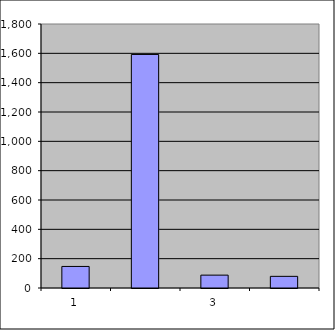
| Category | Series 0 |
|---|---|
| 0 | 147 |
| 1 | 1592.296 |
| 2 | 87.743 |
| 3 | 79.47 |